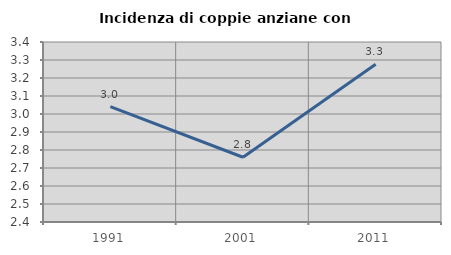
| Category | Incidenza di coppie anziane con figli |
|---|---|
| 1991.0 | 3.041 |
| 2001.0 | 2.76 |
| 2011.0 | 3.276 |